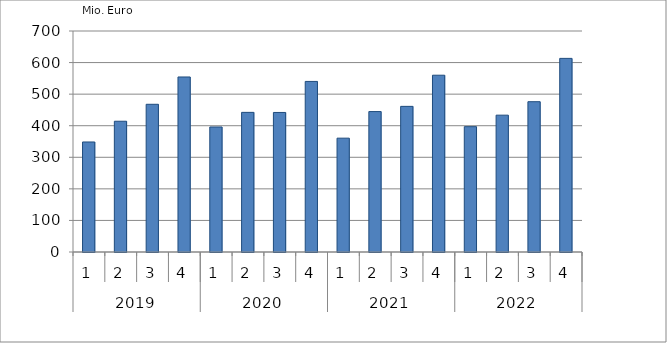
| Category | Ausbaugewerblicher Umsatz3 |
|---|---|
| 0 | 348466.115 |
| 1 | 414145.554 |
| 2 | 467849.207 |
| 3 | 554369.34 |
| 4 | 395996.128 |
| 5 | 442270.528 |
| 6 | 441987.109 |
| 7 | 540250.513 |
| 8 | 360578.959 |
| 9 | 444796.964 |
| 10 | 461290.095 |
| 11 | 559989.337 |
| 12 | 396959.135 |
| 13 | 433420.546 |
| 14 | 476099.112 |
| 15 | 613244.901 |